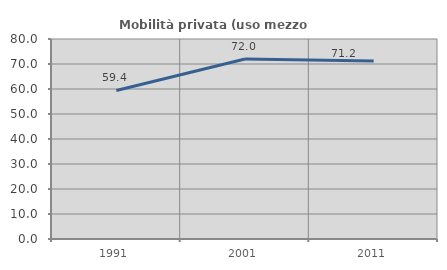
| Category | Mobilità privata (uso mezzo privato) |
|---|---|
| 1991.0 | 59.404 |
| 2001.0 | 71.994 |
| 2011.0 | 71.237 |